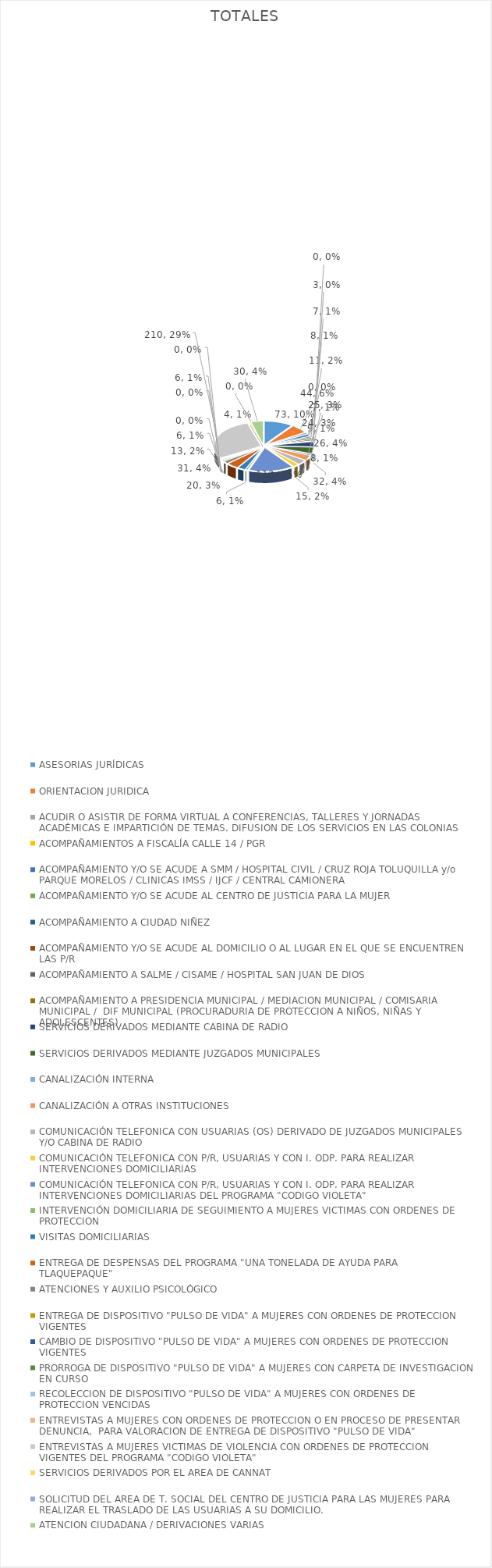
| Category | TOTALES |
|---|---|
| ASESORIAS JURÍDICAS | 73 |
| ORIENTACION JURIDICA | 44 |
| ACUDIR O ASISTIR DE FORMA VIRTUAL A CONFERENCIAS, TALLERES Y JORNADAS ACADÉMICAS E IMPARTICIÓN DE TEMAS. DIFUSION DE LOS SERVICIOS EN LAS COLONIAS | 9 |
| ACOMPAÑAMIENTOS A FISCALÍA CALLE 14 / PGR | 0 |
| ACOMPAÑAMIENTO Y/O SE ACUDE A SMM / HOSPITAL CIVIL / CRUZ ROJA TOLUQUILLA y/o PARQUE MORELOS / CLINICAS IMSS / IJCF / CENTRAL CAMIONERA | 11 |
| ACOMPAÑAMIENTO Y/O SE ACUDE AL CENTRO DE JUSTICIA PARA LA MUJER | 8 |
| ACOMPAÑAMIENTO A CIUDAD NIÑEZ  | 7 |
| ACOMPAÑAMIENTO Y/O SE ACUDE AL DOMICILIO O AL LUGAR EN EL QUE SE ENCUENTREN LAS P/R | 7 |
| ACOMPAÑAMIENTO A SALME / CISAME / HOSPITAL SAN JUAN DE DIOS | 3 |
| ACOMPAÑAMIENTO A PRESIDENCIA MUNICIPAL / MEDIACION MUNICIPAL / COMISARIA MUNICIPAL /  DIF MUNICIPAL (PROCURADURIA DE PROTECCION A NIÑOS, NIÑAS Y ADOLESCENTES) | 0 |
| SERVICIOS DERIVADOS MEDIANTE CABINA DE RADIO | 26 |
| SERVICIOS DERIVADOS MEDIANTE JUZGADOS MUNICIPALES | 32 |
| CANALIZACIÓN INTERNA | 8 |
| CANALIZACIÓN A OTRAS INSTITUCIONES | 25 |
| COMUNICACIÓN TELEFONICA CON USUARIAS (OS) DERIVADO DE JUZGADOS MUNICIPALES Y/O CABINA DE RADIO | 24 |
| COMUNICACIÓN TELEFONICA CON P/R, USUARIAS Y CON I. ODP. PARA REALIZAR INTERVENCIONES DOMICILIARIAS   | 15 |
| COMUNICACIÓN TELEFONICA CON P/R, USUARIAS Y CON I. ODP. PARA REALIZAR INTERVENCIONES DOMICILIARIAS DEL PROGRAMA "CODIGO VIOLETA"  | 113 |
| INTERVENCIÓN DOMICILIARIA DE SEGUIMIENTO A MUJERES VICTIMAS CON ORDENES DE PROTECCION  | 6 |
| VISITAS DOMICILIARIAS  | 20 |
| ENTREGA DE DESPENSAS DEL PROGRAMA "UNA TONELADA DE AYUDA PARA TLAQUEPAQUE" | 31 |
| ATENCIONES Y AUXILIO PSICOLÓGICO | 13 |
| ENTREGA DE DISPOSITIVO "PULSO DE VIDA" A MUJERES CON ORDENES DE PROTECCION VIGENTES | 6 |
| CAMBIO DE DISPOSITIVO "PULSO DE VIDA" A MUJERES CON ORDENES DE PROTECCION VIGENTES | 0 |
| PRORROGA DE DISPOSITIVO "PULSO DE VIDA" A MUJERES CON CARPETA DE INVESTIGACION EN CURSO | 0 |
| RECOLECCION DE DISPOSITIVO "PULSO DE VIDA" A MUJERES CON ORDENES DE PROTECCION VENCIDAS | 6 |
| ENTREVISTAS A MUJERES CON ORDENES DE PROTECCION O EN PROCESO DE PRESENTAR DENUNCIA,  PARA VALORACION DE ENTREGA DE DISPOSITIVO "PULSO DE VIDA" | 0 |
| ENTREVISTAS A MUJERES VICTIMAS DE VIOLENCIA CON ORDENES DE PROTECCION VIGENTES DEL PROGRAMA "CODIGO VIOLETA" | 210 |
| SERVICIOS DERIVADOS POR EL AREA DE CANNAT | 4 |
| SOLICITUD DEL AREA DE T. SOCIAL DEL CENTRO DE JUSTICIA PARA LAS MUJERES PARA REALIZAR EL TRASLADO DE LAS USUARIAS A SU DOMICILIO. | 0 |
| ATENCION CIUDADANA / DERIVACIONES VARIAS | 30 |